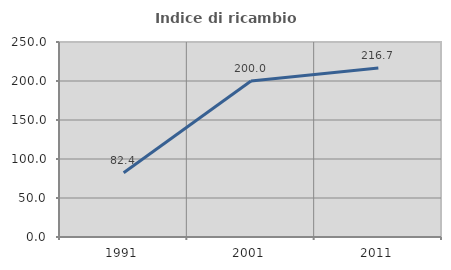
| Category | Indice di ricambio occupazionale  |
|---|---|
| 1991.0 | 82.353 |
| 2001.0 | 200 |
| 2011.0 | 216.667 |